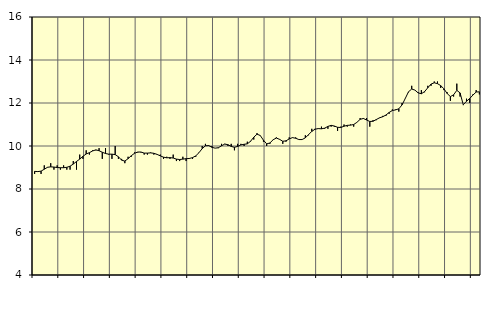
| Category | Piggar | Utbildning, SNI 851 |
|---|---|---|
| nan | 8.7 | 8.82 |
| 87.0 | 8.8 | 8.81 |
| 87.0 | 8.7 | 8.83 |
| 87.0 | 9.1 | 8.92 |
| nan | 9 | 9.01 |
| 88.0 | 9.2 | 9.03 |
| 88.0 | 8.9 | 9.02 |
| 88.0 | 9.1 | 9 |
| nan | 8.9 | 8.99 |
| 89.0 | 9.1 | 8.99 |
| 89.0 | 8.9 | 9.01 |
| 89.0 | 8.9 | 9.06 |
| nan | 9.3 | 9.16 |
| 90.0 | 8.9 | 9.28 |
| 90.0 | 9.6 | 9.39 |
| 90.0 | 9.4 | 9.52 |
| nan | 9.8 | 9.63 |
| 91.0 | 9.6 | 9.69 |
| 91.0 | 9.8 | 9.77 |
| 91.0 | 9.8 | 9.82 |
| nan | 9.9 | 9.78 |
| 92.0 | 9.4 | 9.71 |
| 92.0 | 9.9 | 9.65 |
| 92.0 | 9.6 | 9.62 |
| nan | 9.4 | 9.62 |
| 93.0 | 10 | 9.6 |
| 93.0 | 9.4 | 9.5 |
| 93.0 | 9.4 | 9.34 |
| nan | 9.2 | 9.3 |
| 94.0 | 9.5 | 9.41 |
| 94.0 | 9.5 | 9.55 |
| 94.0 | 9.7 | 9.66 |
| nan | 9.7 | 9.72 |
| 95.0 | 9.7 | 9.72 |
| 95.0 | 9.6 | 9.67 |
| 95.0 | 9.6 | 9.67 |
| nan | 9.7 | 9.68 |
| 96.0 | 9.6 | 9.66 |
| 96.0 | 9.6 | 9.61 |
| 96.0 | 9.6 | 9.54 |
| nan | 9.4 | 9.48 |
| 97.0 | 9.5 | 9.45 |
| 97.0 | 9.4 | 9.46 |
| 97.0 | 9.6 | 9.44 |
| nan | 9.3 | 9.39 |
| 98.0 | 9.3 | 9.37 |
| 98.0 | 9.5 | 9.39 |
| 98.0 | 9.3 | 9.41 |
| nan | 9.4 | 9.42 |
| 99.0 | 9.4 | 9.46 |
| 99.0 | 9.5 | 9.54 |
| 99.0 | 9.7 | 9.69 |
| nan | 10 | 9.88 |
| 0.0 | 10.1 | 10.01 |
| 0.0 | 10 | 10.02 |
| 0.0 | 10 | 9.94 |
| nan | 9.9 | 9.9 |
| 1.0 | 9.9 | 9.92 |
| 1.0 | 10.1 | 10.01 |
| 1.0 | 10.1 | 10.09 |
| nan | 10 | 10.06 |
| 2.0 | 10.1 | 9.98 |
| 2.0 | 9.8 | 9.94 |
| 2.0 | 10.1 | 9.98 |
| nan | 10.1 | 10.05 |
| 3.0 | 10 | 10.08 |
| 3.0 | 10.2 | 10.1 |
| 3.0 | 10.2 | 10.22 |
| nan | 10.3 | 10.41 |
| 4.0 | 10.6 | 10.55 |
| 4.0 | 10.5 | 10.49 |
| 4.0 | 10.2 | 10.27 |
| nan | 10 | 10.1 |
| 5.0 | 10.1 | 10.14 |
| 5.0 | 10.3 | 10.29 |
| 5.0 | 10.4 | 10.37 |
| nan | 10.3 | 10.31 |
| 6.0 | 10.1 | 10.22 |
| 6.0 | 10.2 | 10.24 |
| 6.0 | 10.4 | 10.33 |
| nan | 10.4 | 10.39 |
| 7.0 | 10.4 | 10.36 |
| 7.0 | 10.3 | 10.3 |
| 7.0 | 10.3 | 10.3 |
| nan | 10.5 | 10.38 |
| 8.0 | 10.5 | 10.53 |
| 8.0 | 10.8 | 10.68 |
| 8.0 | 10.8 | 10.78 |
| nan | 10.8 | 10.81 |
| 9.0 | 10.9 | 10.8 |
| 9.0 | 10.8 | 10.83 |
| 9.0 | 10.8 | 10.91 |
| nan | 10.9 | 10.96 |
| 10.0 | 10.9 | 10.93 |
| 10.0 | 10.7 | 10.87 |
| 10.0 | 10.9 | 10.86 |
| nan | 11 | 10.92 |
| 11.0 | 10.9 | 10.96 |
| 11.0 | 11 | 10.97 |
| 11.0 | 10.9 | 11 |
| nan | 11.1 | 11.1 |
| 12.0 | 11.3 | 11.24 |
| 12.0 | 11.3 | 11.28 |
| 12.0 | 11.3 | 11.21 |
| nan | 10.9 | 11.14 |
| 13.0 | 11.2 | 11.15 |
| 13.0 | 11.2 | 11.23 |
| 13.0 | 11.3 | 11.31 |
| nan | 11.4 | 11.36 |
| 14.0 | 11.4 | 11.44 |
| 14.0 | 11.5 | 11.56 |
| 14.0 | 11.7 | 11.65 |
| nan | 11.7 | 11.68 |
| 15.0 | 11.6 | 11.73 |
| 15.0 | 12 | 11.91 |
| 15.0 | 12.2 | 12.21 |
| nan | 12.5 | 12.52 |
| 16.0 | 12.8 | 12.65 |
| 16.0 | 12.6 | 12.6 |
| 16.0 | 12.5 | 12.47 |
| nan | 12.6 | 12.43 |
| 17.0 | 12.5 | 12.53 |
| 17.0 | 12.8 | 12.71 |
| 17.0 | 12.8 | 12.88 |
| nan | 13 | 12.94 |
| 18.0 | 13 | 12.9 |
| 18.0 | 12.7 | 12.81 |
| 18.0 | 12.6 | 12.66 |
| nan | 12.5 | 12.44 |
| 19.0 | 12.1 | 12.3 |
| 19.0 | 12.3 | 12.38 |
| 19.0 | 12.9 | 12.59 |
| nan | 12.3 | 12.47 |
| 20.0 | 11.9 | 11.92 |
| 20.0 | 12.2 | 12.08 |
| 20.0 | 12 | 12.21 |
| nan | 12.4 | 12.37 |
| 21.0 | 12.6 | 12.51 |
| 21.0 | 12.4 | 12.52 |